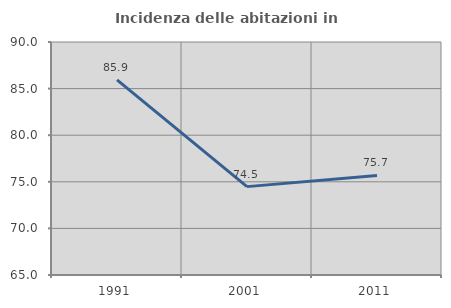
| Category | Incidenza delle abitazioni in proprietà  |
|---|---|
| 1991.0 | 85.938 |
| 2001.0 | 74.483 |
| 2011.0 | 75.684 |